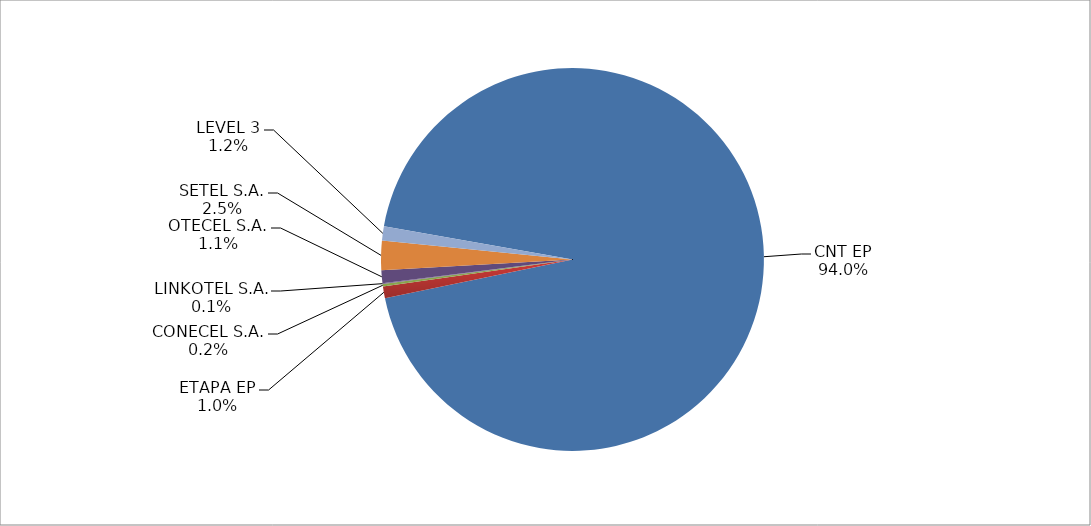
| Category | Series 0 |
|---|---|
| CNT EP | 2452 |
| ETAPA EP | 26 |
| CONECEL S.A. | 5 |
| LINKOTEL S.A. | 2 |
| OTECEL S.A. | 28 |
| SETEL S.A. | 65 |
| LEVEL 3 | 31 |